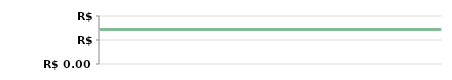
| Category | ANO |
|---|---|
| 2013-04-23 | 143800 |
| 2013-04-25 | 143800 |
| 2013-05-07 | 143800 |
| 2013-05-14 | 143800 |
| 2013-05-14 | 143800 |
| 2013-05-29 | 143800 |
| 2013-06-10 | 143800 |
| 2013-06-21 | 143800 |
| 2013-07-06 | 143800 |
| 2013-08-05 | 143800 |
| 2013-08-19 | 143800 |
| 2013-09-04 | 143800 |
| 2013-09-20 | 143800 |
| 2013-09-25 | 143800 |
| 2013-10-15 | 143800 |
| 2013-11-05 | 143800 |
| 2013-11-26 | 143800 |
| 2013-11-30 | 143800 |
| 2013-12-11 | 143800 |